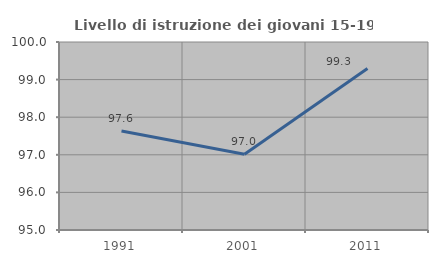
| Category | Livello di istruzione dei giovani 15-19 anni |
|---|---|
| 1991.0 | 97.633 |
| 2001.0 | 97.015 |
| 2011.0 | 99.296 |